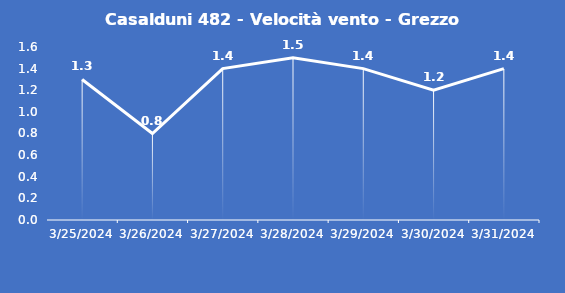
| Category | Casalduni 482 - Velocità vento - Grezzo (m/s) |
|---|---|
| 3/25/24 | 1.3 |
| 3/26/24 | 0.8 |
| 3/27/24 | 1.4 |
| 3/28/24 | 1.5 |
| 3/29/24 | 1.4 |
| 3/30/24 | 1.2 |
| 3/31/24 | 1.4 |